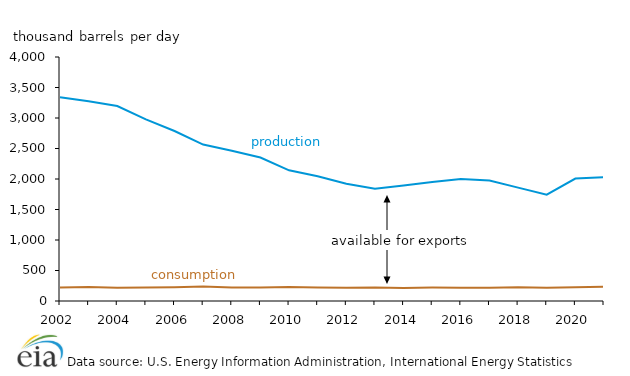
| Category | Production | Consumption |
|---|---|---|
| 2002.0 | 3341.884 | 219.997 |
| 2003.0 | 3272.957 | 229.973 |
| 2004.0 | 3196.588 | 217.413 |
| 2005.0 | 2978.132 | 221.603 |
| 2006.0 | 2786.472 | 227.101 |
| 2007.0 | 2564.894 | 238.277 |
| 2008.0 | 2464.522 | 223.35 |
| 2009.0 | 2352.555 | 222.8 |
| 2010.0 | 2142.166 | 228.833 |
| 2011.0 | 2046.475 | 220.238 |
| 2012.0 | 1922.146 | 215.221 |
| 2013.0 | 1842.196 | 222.899 |
| 2014.0 | 1892.673 | 214.422 |
| 2015.0 | 1952.357 | 219.589 |
| 2016.0 | 1999.4 | 215.959 |
| 2017.0 | 1975.645 | 219.205 |
| 2018.0 | 1858.524 | 226.595 |
| 2019.0 | 1742.763 | 215.882 |
| 2020.0 | 2007.167 | 224.631 |
| 2021.0 | 2030.848 | 235.638 |